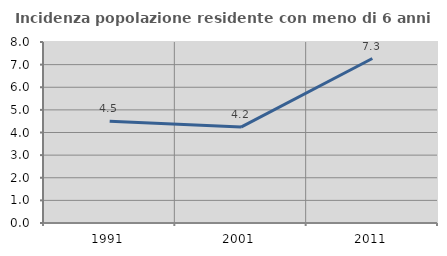
| Category | Incidenza popolazione residente con meno di 6 anni |
|---|---|
| 1991.0 | 4.493 |
| 2001.0 | 4.24 |
| 2011.0 | 7.27 |